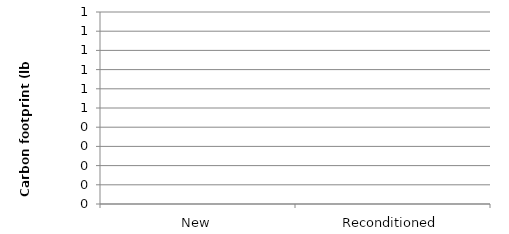
| Category | Series 0 |
|---|---|
| New | 0 |
| Reconditioned | 0 |